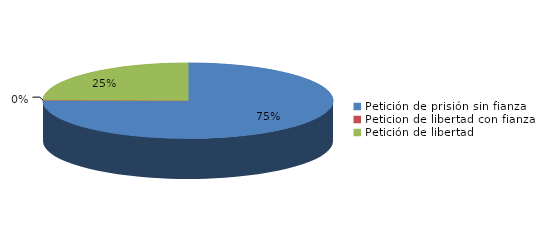
| Category | Series 0 |
|---|---|
| Petición de prisión sin fianza | 82 |
| Peticion de libertad con fianza | 0 |
| Petición de libertad | 27 |